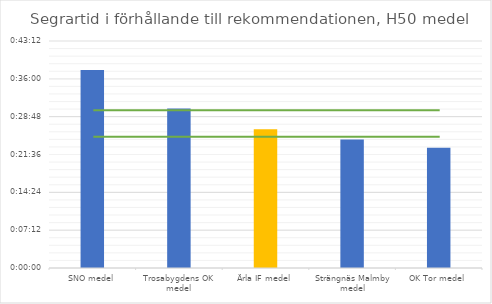
| Category | H50 tid |
|---|---|
| SNO medel | 0.026 |
| Trosabygdens OK medel | 0.021 |
| Ärla IF medel | 0.018 |
| Strängnäs Malmby medel | 0.017 |
| OK Tor medel | 0.016 |